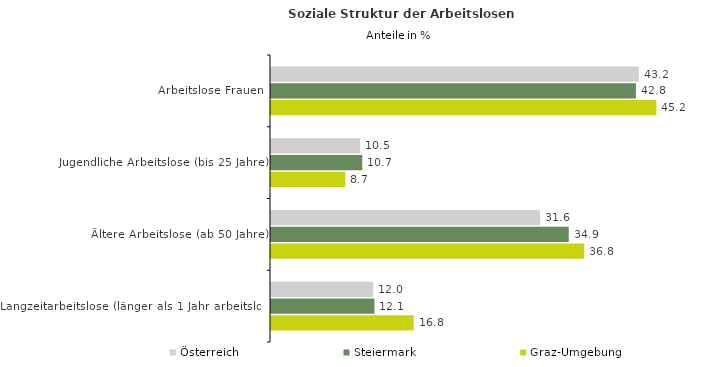
| Category | Österreich | Steiermark | Graz-Umgebung |
|---|---|---|---|
| Arbeitslose Frauen | 43.18 | 42.833 | 45.233 |
| Jugendliche Arbeitslose (bis 25 Jahre) | 10.46 | 10.711 | 8.721 |
| Ältere Arbeitslose (ab 50 Jahre) | 31.584 | 34.947 | 36.761 |
| Langzeitarbeitslose (länger als 1 Jahr arbeitslos) | 11.999 | 12.142 | 16.755 |